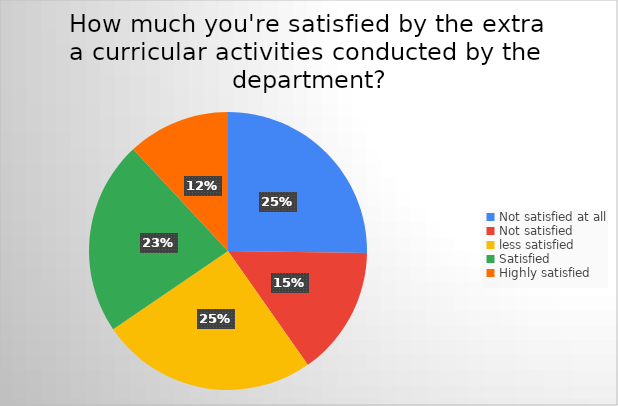
| Category | Series 0 |
|---|---|
| Not satisfied at all | 57 |
| Not satisfied  | 34 |
| less satisfied | 57 |
| Satisfied | 51 |
| Highly satisfied | 27 |